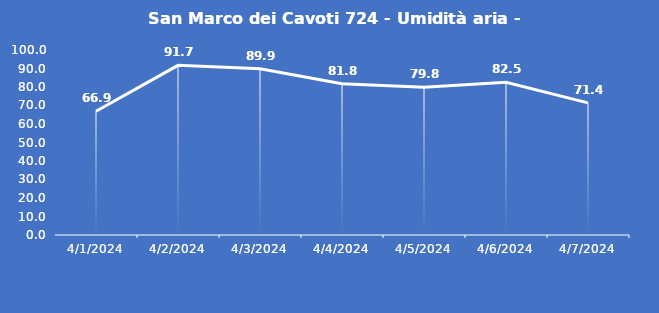
| Category | San Marco dei Cavoti 724 - Umidità aria - Grezzo (%) |
|---|---|
| 4/1/24 | 66.9 |
| 4/2/24 | 91.7 |
| 4/3/24 | 89.9 |
| 4/4/24 | 81.8 |
| 4/5/24 | 79.8 |
| 4/6/24 | 82.5 |
| 4/7/24 | 71.4 |